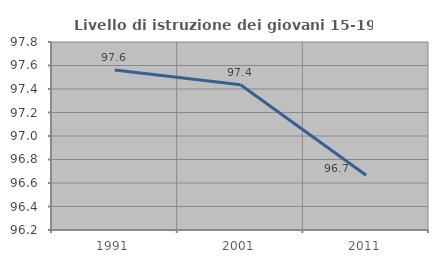
| Category | Livello di istruzione dei giovani 15-19 anni |
|---|---|
| 1991.0 | 97.561 |
| 2001.0 | 97.436 |
| 2011.0 | 96.667 |